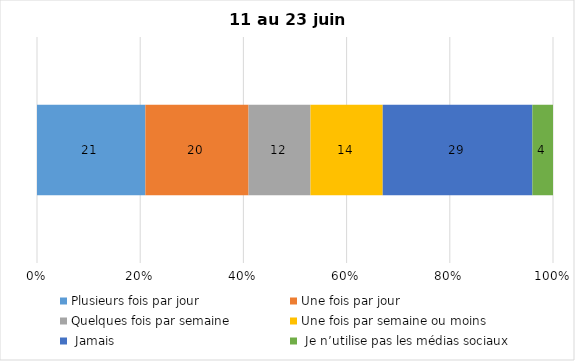
| Category | Plusieurs fois par jour | Une fois par jour | Quelques fois par semaine   | Une fois par semaine ou moins   |  Jamais   |  Je n’utilise pas les médias sociaux |
|---|---|---|---|---|---|---|
| 0 | 21 | 20 | 12 | 14 | 29 | 4 |